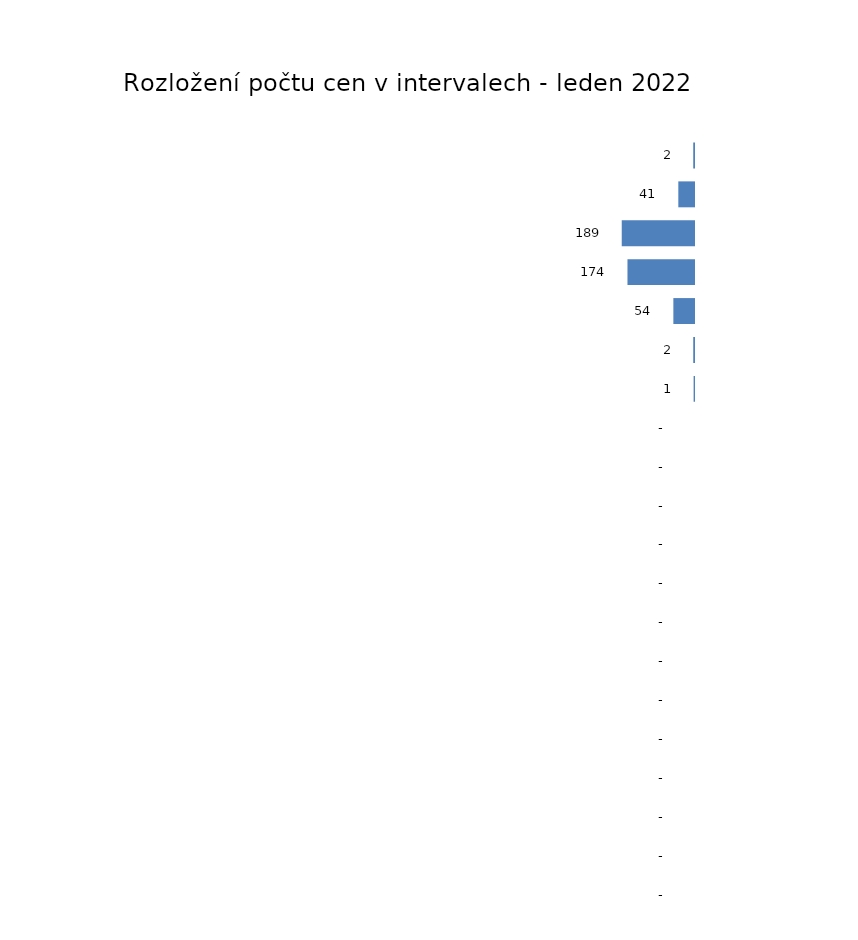
| Category | Rozložení počtu cen v intervalech - leden |
|---|---|
| ( 0 - 250 > | 2 |
| ( 250 - 500 > | 41 |
| ( 500 - 750 > | 189 |
| ( 750 - 1000 > | 174 |
| ( 1000 - 1250 > | 54 |
| ( 1250 - 1500 > | 2 |
| ( 1500 - 1750 > | 1 |
| ( 1750 - 2000 > | 0 |
| ( 2000 - 2250 > | 0 |
| ( 2250 - 2500 > | 0 |
| ( 2500 - 2750 > | 0 |
| ( 2750 - 3000 > | 0 |
| ( 3000 - 3250 > | 0 |
| ( 3250 - 3500 > | 0 |
| ( 3500 - 3750 > | 0 |
| ( 3750 - 4000 > | 0 |
| ( 4000 - 4250 > | 0 |
| ( 4250 - 4500 > | 0 |
| ( 4500 - 4750 > | 0 |
| ( 4750 - 5000 > | 0 |